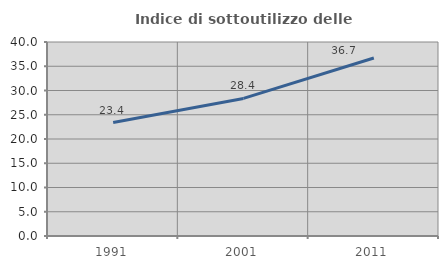
| Category | Indice di sottoutilizzo delle abitazioni  |
|---|---|
| 1991.0 | 23.4 |
| 2001.0 | 28.37 |
| 2011.0 | 36.711 |